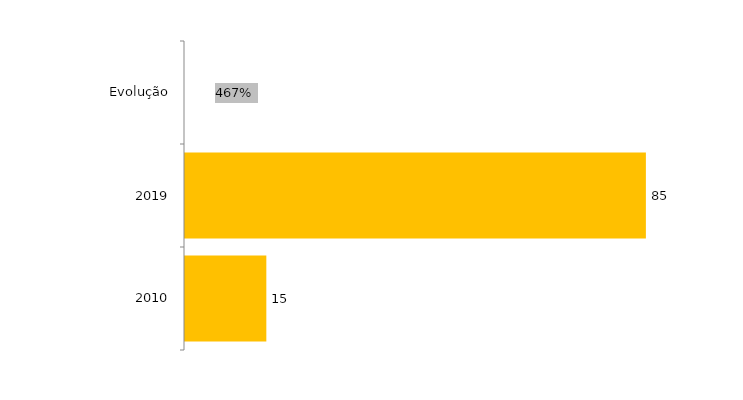
| Category | Evolução Matriculados |
|---|---|
| 2010 | 15 |
| 2019 | 85 |
| Evolução | 4.667 |